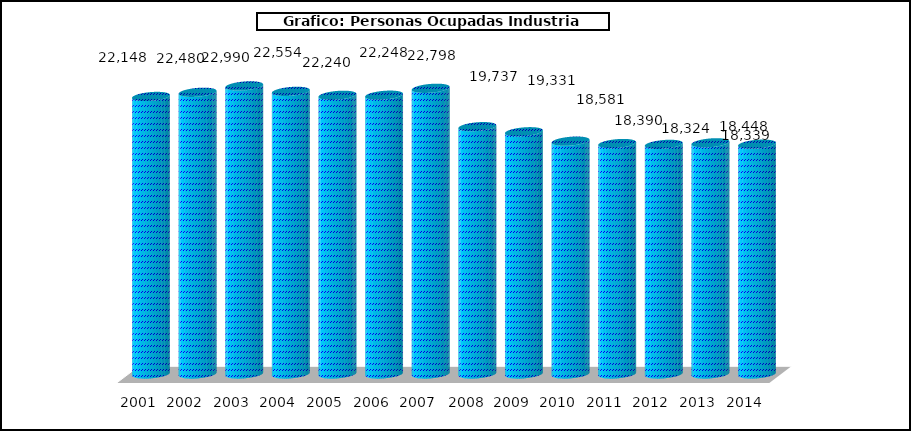
| Category |  Personas Ocupadas Industria Pesquera |
|---|---|
| 2001 | 22148 |
| 2002 | 22480 |
| 2003 | 22990 |
| 2004 | 22554 |
| 2005 | 22240 |
| 2006 | 22248 |
| 2007 | 22798 |
| 2008 * | 19737 |
| 2009 | 19331 |
| 2010 | 18581 |
| 2011 | 18390 |
| 2012 | 18324 |
| 2013 | 18448 |
| 2014 | 18339 |